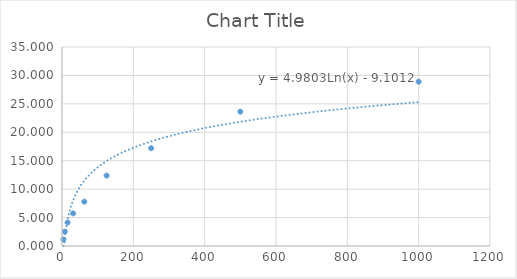
| Category | Series 0 |
|---|---|
| 3.91 | 1.147 |
| 7.81 | 2.523 |
| 15.62 | 4.128 |
| 31.25 | 5.734 |
| 62.5 | 7.798 |
| 125.0 | 12.385 |
| 250.0 | 17.202 |
| 500.0 | 23.624 |
| 1000.0 | 28.899 |